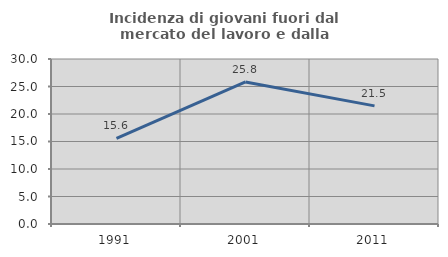
| Category | Incidenza di giovani fuori dal mercato del lavoro e dalla formazione  |
|---|---|
| 1991.0 | 15.565 |
| 2001.0 | 25.822 |
| 2011.0 | 21.475 |